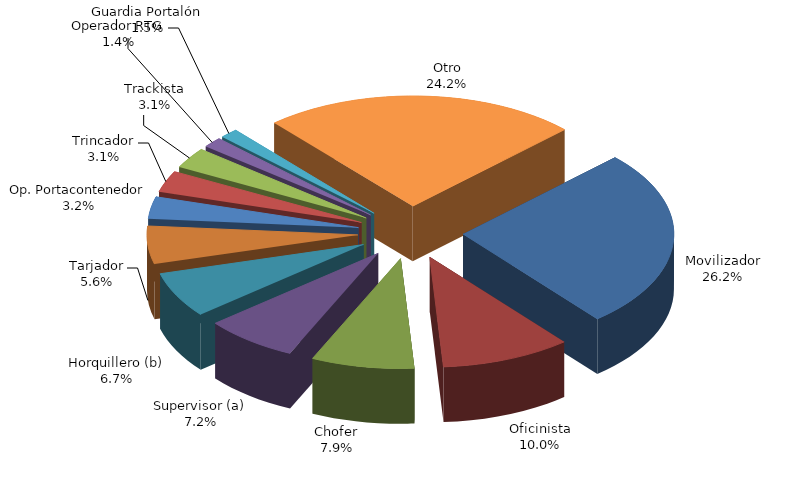
| Category | Series 0 |
|---|---|
| Movilizador | 343182 |
| Oficinista | 130176 |
| Chofer | 103330 |
| Supervisor (a) | 93896 |
| Horquillero (b) | 87456 |
| Tarjador | 72733 |
| Op. Portacontenedor | 42190 |
| Trincador | 41117 |
| Trackista | 39899 |
| Guardia Portalón | 19665 |
| Operador RTG | 18299 |
| Otro | 316119 |